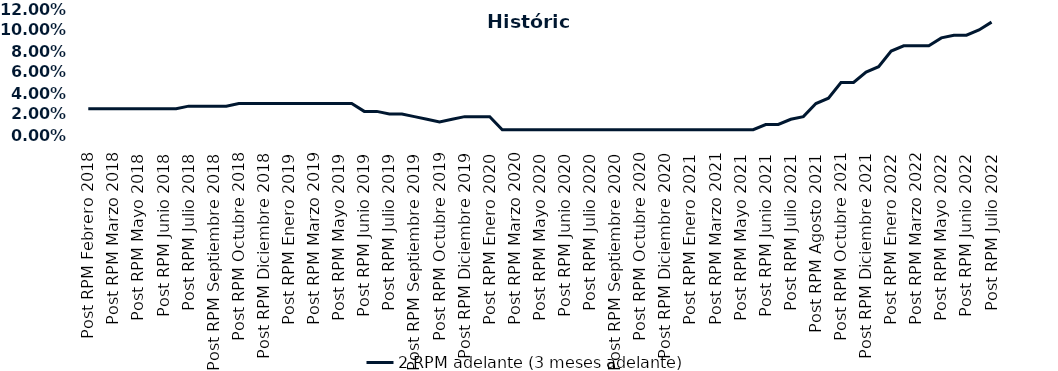
| Category | 2 RPM adelante (3 meses adelante) |
|---|---|
| Post RPM Febrero 2018 | 0.025 |
| Pre RPM Marzo 2018 | 0.025 |
| Post RPM Marzo 2018 | 0.025 |
| Pre RPM Mayo 2018 | 0.025 |
| Post RPM Mayo 2018 | 0.025 |
| Pre RPM Junio 2018 | 0.025 |
| Post RPM Junio 2018 | 0.025 |
| Pre RPM Julio 2018 | 0.025 |
| Post RPM Julio 2018 | 0.028 |
| Pre RPM Septiembre 2018 | 0.028 |
| Post RPM Septiembre 2018 | 0.028 |
| Pre RPM Octubre 2018 | 0.028 |
| Post RPM Octubre 2018 | 0.03 |
| Pre RPM Diciembre 2018 | 0.03 |
| Post RPM Diciembre 2018 | 0.03 |
| Pre RPM Enero 2019 | 0.03 |
| Post RPM Enero 2019 | 0.03 |
| Pre RPM Marzo 2019 | 0.03 |
| Post RPM Marzo 2019 | 0.03 |
| Pre RPM Mayo 2019 | 0.03 |
| Post RPM Mayo 2019 | 0.03 |
| Pre RPM Junio 2019 | 0.03 |
| Post RPM Junio 2019 | 0.022 |
| Pre RPM Julio 2019 | 0.022 |
| Post RPM Julio 2019 | 0.02 |
| Pre RPM Septiembre 2019 | 0.02 |
| Post RPM Septiembre 2019 | 0.018 |
| Pre RPM Octubre 2019 | 0.015 |
| Post RPM Octubre 2019 | 0.012 |
| Pre RPM Diciembre 2019 | 0.015 |
| Post RPM Diciembre 2019 | 0.018 |
| Pre RPM Enero 2020 | 0.018 |
| Post RPM Enero 2020 | 0.018 |
| Pre RPM Marzo 2020 | 0.005 |
| Post RPM Marzo 2020 | 0.005 |
| Pre RPM Mayo 2020 | 0.005 |
| Post RPM Mayo 2020 | 0.005 |
| Pre RPM Junio 2020 | 0.005 |
| Post RPM Junio 2020 | 0.005 |
| Pre RPM Julio 2020 | 0.005 |
| Post RPM Julio 2020 | 0.005 |
| Pre RPM Septiembre 2020 | 0.005 |
| Post RPM Septiembre 2020 | 0.005 |
| Pre RPM Octubre 2020 | 0.005 |
| Post RPM Octubre 2020 | 0.005 |
| Pre RPM Diciembre 2020 | 0.005 |
| Post RPM Diciembre 2020 | 0.005 |
| Pre RPM Enero 2021 | 0.005 |
| Post RPM Enero 2021 | 0.005 |
| Pre RPM Marzo 2021 | 0.005 |
| Post RPM Marzo 2021 | 0.005 |
| Pre RPM Mayo 2021 | 0.005 |
| Post RPM Mayo 2021 | 0.005 |
| Pre RPM Junio 2021 | 0.005 |
| Post RPM Junio 2021 | 0.01 |
| Pre RPM Julio 2021 | 0.01 |
| Post RPM Julio 2021 | 0.015 |
| Pre RPM Agosto 2021 | 0.018 |
| Post RPM Agosto 2021 | 0.03 |
| Pre RPM Octubre 2021 | 0.035 |
| Post RPM Octubre 2021 | 0.05 |
| Pre RPM Diciembre 2021 | 0.05 |
| Post RPM Diciembre 2021 | 0.06 |
| Pre RPM Enero 2022 | 0.065 |
| Post RPM Enero 2022 | 0.08 |
| Pre RPM Marzo 2022 | 0.085 |
| Post RPM Marzo 2022 | 0.085 |
| Pre RPM Mayo 2022 | 0.085 |
| Post RPM Mayo 2022 | 0.092 |
| Pre RPM Junio 2022 | 0.095 |
| Post RPM Junio 2022 | 0.095 |
| Pre RPM Julio 2022 | 0.1 |
| Post RPM Julio 2022 | 0.108 |